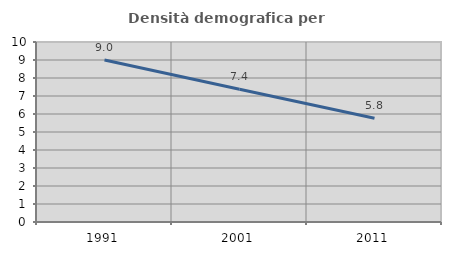
| Category | Densità demografica |
|---|---|
| 1991.0 | 9.004 |
| 2001.0 | 7.377 |
| 2011.0 | 5.76 |